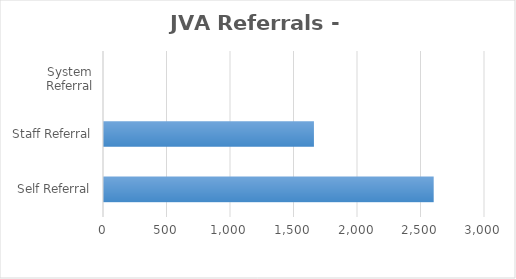
| Category | Series 0 |
|---|---|
| Self Referral | 2596 |
| Staff Referral | 1653 |
| System Referral | 0 |